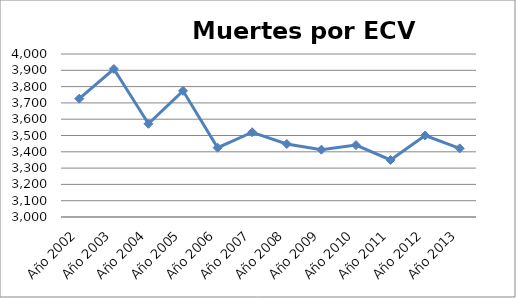
| Category | Series 0 |
|---|---|
| Año 2002 | 3726 |
| Año 2003 | 3908 |
| Año 2004 | 3572 |
| Año 2005 | 3774 |
| Año 2006 | 3425 |
| Año 2007 | 3520 |
| Año 2008 | 3448 |
| Año 2009 | 3413 |
| Año 2010 | 3441 |
| Año 2011 | 3350 |
| Año 2012 | 3500 |
| Año 2013 | 3421 |